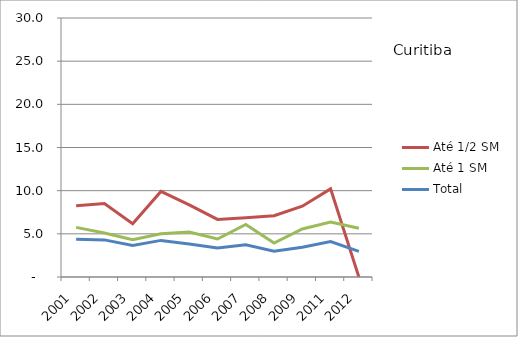
| Category | Até 1/2 SM | Até 1 SM | Total |
|---|---|---|---|
| 2001.0 | 8.24 | 5.75 | 4.38 |
| 2002.0 | 8.52 | 5.09 | 4.3 |
| 2003.0 | 6.16 | 4.31 | 3.64 |
| 2004.0 | 9.91 | 5 | 4.24 |
| 2005.0 | 8.36 | 5.2 | 3.82 |
| 2006.0 | 6.67 | 4.4 | 3.36 |
| 2007.0 | 6.86 | 6.09 | 3.73 |
| 2008.0 | 7.09 | 3.93 | 2.98 |
| 2009.0 | 8.2 | 5.56 | 3.45 |
| 2011.0 | 10.21 | 6.37 | 4.11 |
| 2012.0 | 0 | 5.65 | 2.96 |